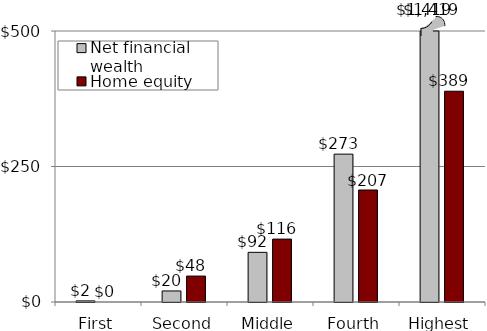
| Category | Net financial wealth | Home equity |
|---|---|---|
| First | 2.036 | 0 |
| Second | 20.36 | 47.846 |
| Middle | 91.62 | 116.052 |
| Fourth | 272.824 | 206.654 |
| Highest | 1419 | 388.876 |